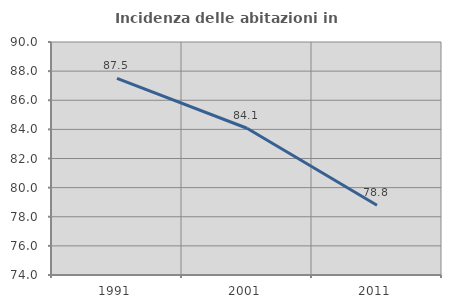
| Category | Incidenza delle abitazioni in proprietà  |
|---|---|
| 1991.0 | 87.5 |
| 2001.0 | 84.076 |
| 2011.0 | 78.788 |